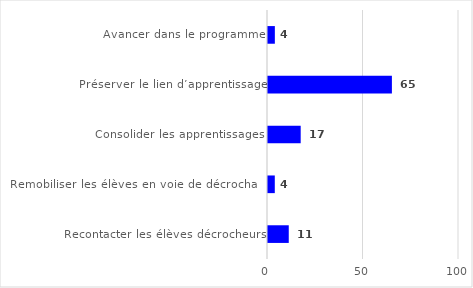
| Category | Series 0 |
|---|---|
| Avancer dans le programme | 3.588 |
| Préserver le lien d’apprentissage | 64.87 |
| Consolider les apprentissages | 17.118 |
| Remobiliser les élèves en voie de décrochage | 3.556 |
| Recontacter les élèves décrocheurs | 10.868 |